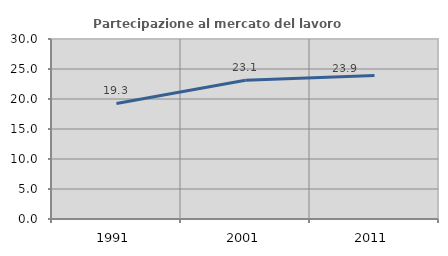
| Category | Partecipazione al mercato del lavoro  femminile |
|---|---|
| 1991.0 | 19.255 |
| 2001.0 | 23.113 |
| 2011.0 | 23.92 |